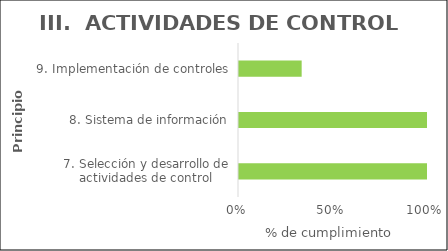
| Category | Principios |
|---|---|
| 7. Selección y desarrollo de actividades de control | 1 |
| 8. Sistema de información | 1 |
| 9. Implementación de controles | 0.333 |